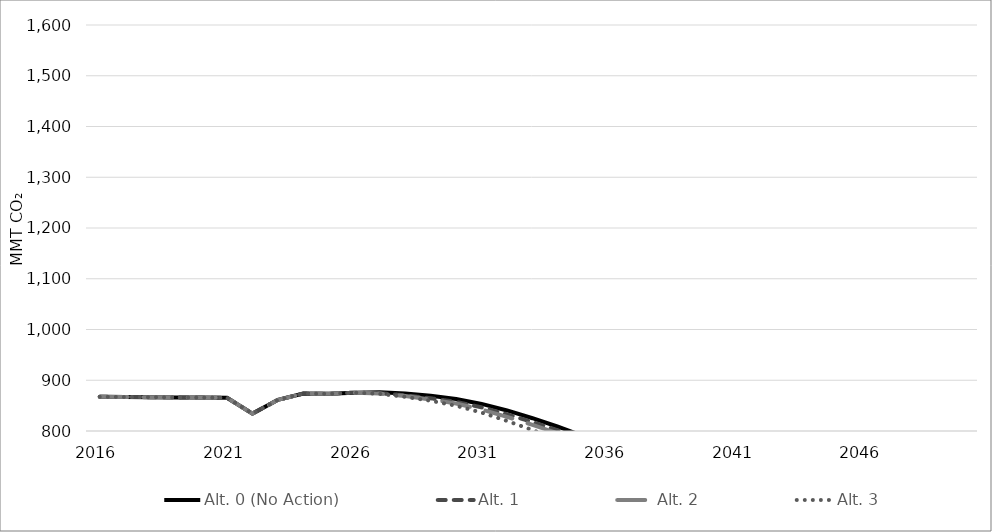
| Category | Alt. 0 (No Action) | Alt. 1 | Alt. 2 | Alt. 3 |
|---|---|---|---|---|
| 2016.0 | 867.375 | 867.375 | 867.375 | 867.375 |
| 2017.0 | 866.991 | 866.991 | 866.991 | 866.991 |
| 2018.0 | 866.606 | 866.606 | 866.606 | 866.606 |
| 2019.0 | 866.222 | 866.222 | 866.222 | 866.222 |
| 2020.0 | 865.838 | 865.838 | 865.838 | 865.838 |
| 2021.0 | 865.454 | 865.454 | 865.454 | 865.454 |
| 2022.0 | 834.271 | 834.271 | 834.271 | 834.271 |
| 2023.0 | 861.392 | 861.392 | 861.392 | 861.392 |
| 2024.0 | 873.777 | 873.777 | 873.777 | 873.777 |
| 2025.0 | 873.247 | 873.247 | 873.247 | 873.247 |
| 2026.0 | 875.583 | 875.583 | 875.583 | 875.583 |
| 2027.0 | 876.187 | 874.513 | 873.795 | 873.157 |
| 2028.0 | 873.704 | 870.343 | 868.748 | 867.291 |
| 2029.0 | 869.421 | 864.51 | 862.054 | 859.611 |
| 2030.0 | 863.177 | 857.358 | 854.022 | 849.724 |
| 2031.0 | 853.374 | 846.585 | 842.424 | 836.229 |
| 2032.0 | 840.499 | 832.85 | 827.79 | 819.822 |
| 2033.0 | 825.172 | 817.636 | 812.159 | 801.88 |
| 2034.0 | 808.401 | 801.258 | 795.371 | 782.746 |
| 2035.0 | 790.051 | 783.287 | 777.024 | 762.148 |
| 2036.0 | 772.213 | 765.639 | 759.127 | 741.909 |
| 2037.0 | 753.615 | 747.206 | 740.468 | 721.394 |
| 2038.0 | 735.428 | 729.408 | 722.591 | 701.757 |
| 2039.0 | 716.83 | 710.918 | 703.261 | 681.316 |
| 2040.0 | 696.609 | 690.644 | 682.365 | 659.487 |
| 2041.0 | 677.78 | 671.948 | 662.789 | 639.41 |
| 2042.0 | 659.316 | 653.775 | 644.041 | 619.892 |
| 2043.0 | 641.708 | 636.558 | 626.21 | 601.31 |
| 2044.0 | 623.161 | 618.299 | 607.033 | 581.859 |
| 2045.0 | 601.755 | 598.169 | 586.441 | 561.532 |
| 2046.0 | 579.557 | 577.342 | 565.676 | 540.185 |
| 2047.0 | 557.734 | 556.915 | 545.265 | 519.309 |
| 2048.0 | 536.37 | 537.001 | 525.39 | 498.676 |
| 2049.0 | 513.319 | 515.178 | 503.912 | 476.834 |
| 2050.0 | 489.345 | 492.167 | 481.575 | 454.411 |